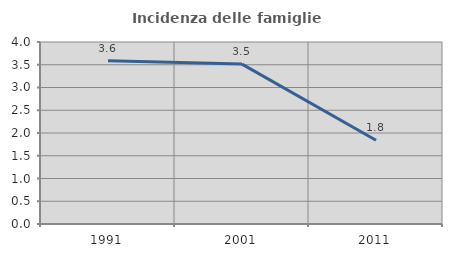
| Category | Incidenza delle famiglie numerose |
|---|---|
| 1991.0 | 3.586 |
| 2001.0 | 3.515 |
| 2011.0 | 1.84 |